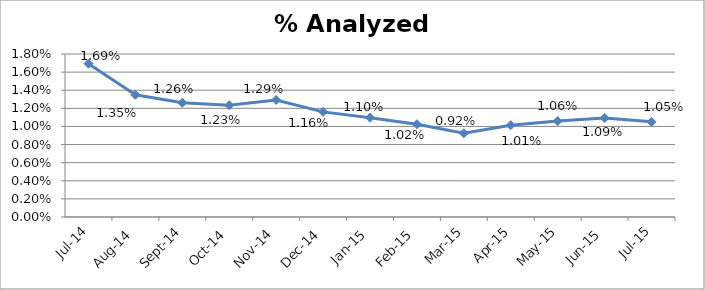
| Category | Series 0 |
|---|---|
| 2014-07-01 | 0.017 |
| 2014-08-01 | 0.013 |
| 2014-09-01 | 0.013 |
| 2014-10-01 | 0.012 |
| 2014-11-01 | 0.013 |
| 2014-12-01 | 0.012 |
| 2015-01-01 | 0.011 |
| 2015-02-01 | 0.01 |
| 2015-03-01 | 0.009 |
| 2015-04-01 | 0.01 |
| 2015-05-01 | 0.011 |
| 2015-06-01 | 0.011 |
| 2015-07-01 | 0.011 |